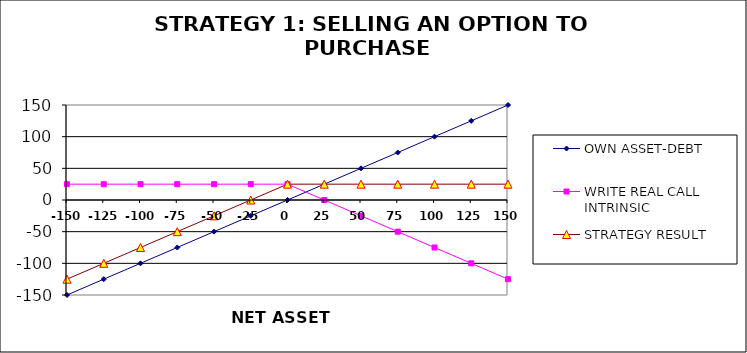
| Category | OWN ASSET-DEBT | WRITE REAL CALL INTRINSIC | STRATEGY RESULT |
|---|---|---|---|
| -150.0 | -150 | 25 | -125 |
| -125.0 | -125 | 25 | -100 |
| -100.0 | -100 | 25 | -75 |
| -75.0 | -75 | 25 | -50 |
| -50.0 | -50 | 25 | -25 |
| -25.0 | -25 | 25 | 0 |
| 0.0 | 0 | 25 | 25 |
| 25.0 | 25 | 0 | 25 |
| 50.0 | 50 | -25 | 25 |
| 75.0 | 75 | -50 | 25 |
| 100.0 | 100 | -75 | 25 |
| 125.0 | 125 | -100 | 25 |
| 150.0 | 150 | -125 | 25 |